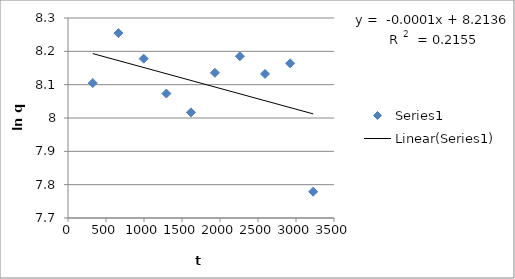
| Category | Series 0 |
|---|---|
| 326.01 | 8.105 |
| 663.505 | 8.255 |
| 995.7 | 8.178 |
| 1294.28 | 8.073 |
| 1617.475 | 8.017 |
| 1933.12 | 8.136 |
| 2261.73 | 8.185 |
| 2592.27 | 8.132 |
| 2922.62 | 8.164 |
| 3225.785 | 7.779 |